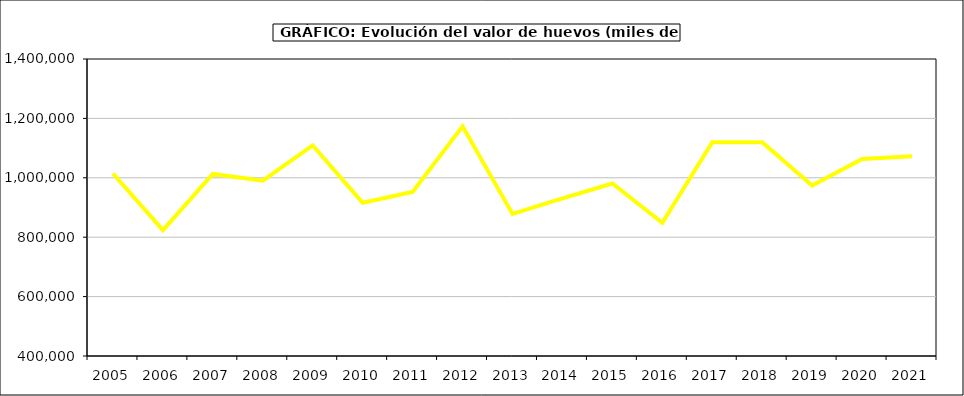
| Category | huevos |
|---|---|
| 2005.0 | 1014518.979 |
| 2006.0 | 823874.691 |
| 2007.0 | 1012879.578 |
| 2008.0 | 990180.415 |
| 2009.0 | 1109356.704 |
| 2010.0 | 915832.84 |
| 2011.0 | 952462.311 |
| 2012.0 | 1173176.818 |
| 2013.0 | 878243.026 |
| 2014.0 | 930912.202 |
| 2015.0 | 980944.68 |
| 2016.0 | 848224 |
| 2017.0 | 1119773.503 |
| 2018.0 | 1119711.329 |
| 2019.0 | 974085.433 |
| 2020.0 | 1062988.438 |
| 2021.0 | 1072846 |